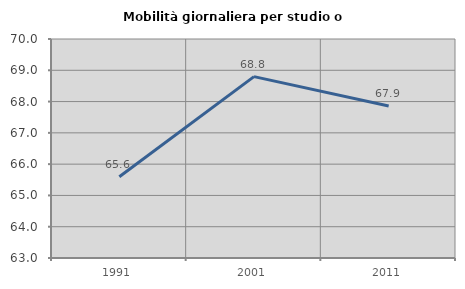
| Category | Mobilità giornaliera per studio o lavoro |
|---|---|
| 1991.0 | 65.595 |
| 2001.0 | 68.798 |
| 2011.0 | 67.86 |